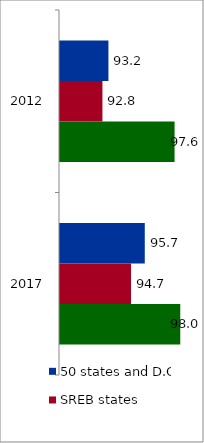
| Category | 50 states and D.C. | SREB states | State |
|---|---|---|---|
| 2012.0 | 93.228 | 92.829 | 97.638 |
| 2017.0 | 95.651 | 94.735 | 98.018 |